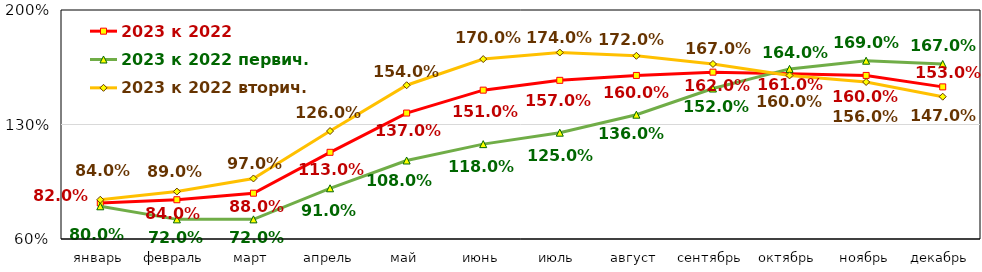
| Category | 2023 к 2022 | 2023 к 2022 первич. | 2023 к 2022 вторич. |
|---|---|---|---|
| январь | 0.82 | 0.8 | 0.84 |
| февраль | 0.84 | 0.72 | 0.89 |
| март | 0.88 | 0.72 | 0.97 |
| апрель | 1.13 | 0.91 | 1.26 |
| май | 1.37 | 1.08 | 1.54 |
| июнь | 1.51 | 1.18 | 1.7 |
| июль | 1.57 | 1.25 | 1.74 |
| август | 1.6 | 1.36 | 1.72 |
| сентябрь | 1.62 | 1.52 | 1.67 |
| октябрь | 1.61 | 1.64 | 1.6 |
| ноябрь | 1.6 | 1.69 | 1.56 |
| декабрь | 1.53 | 1.67 | 1.47 |